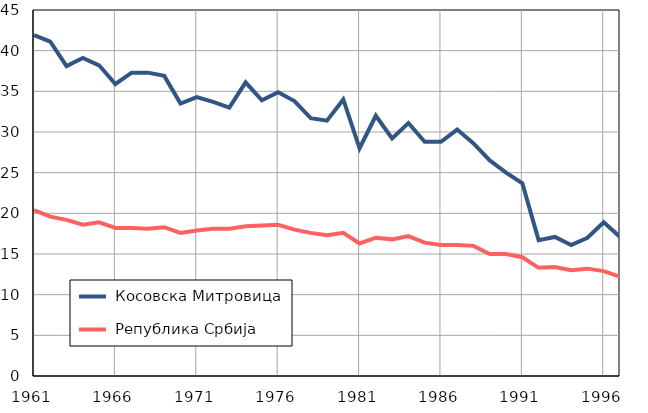
| Category |  Косовска Митровица |  Република Србија |
|---|---|---|
| 1961.0 | 41.9 | 20.4 |
| 1962.0 | 41.1 | 19.6 |
| 1963.0 | 38.1 | 19.2 |
| 1964.0 | 39.1 | 18.6 |
| 1965.0 | 38.2 | 18.9 |
| 1966.0 | 35.9 | 18.2 |
| 1967.0 | 37.3 | 18.2 |
| 1968.0 | 37.3 | 18.1 |
| 1969.0 | 36.9 | 18.3 |
| 1970.0 | 33.5 | 17.6 |
| 1971.0 | 34.3 | 17.9 |
| 1972.0 | 33.7 | 18.1 |
| 1973.0 | 33 | 18.1 |
| 1974.0 | 36.1 | 18.4 |
| 1975.0 | 33.9 | 18.5 |
| 1976.0 | 34.9 | 18.6 |
| 1977.0 | 33.8 | 18 |
| 1978.0 | 31.7 | 17.6 |
| 1979.0 | 31.4 | 17.3 |
| 1980.0 | 34 | 17.6 |
| 1981.0 | 28 | 16.3 |
| 1982.0 | 32 | 17 |
| 1983.0 | 29.2 | 16.8 |
| 1984.0 | 31.1 | 17.2 |
| 1985.0 | 28.8 | 16.4 |
| 1986.0 | 28.8 | 16.1 |
| 1987.0 | 30.3 | 16.1 |
| 1988.0 | 28.6 | 16 |
| 1989.0 | 26.5 | 15 |
| 1990.0 | 25 | 15 |
| 1991.0 | 23.7 | 14.6 |
| 1992.0 | 16.7 | 13.3 |
| 1993.0 | 17.1 | 13.4 |
| 1994.0 | 16.1 | 13 |
| 1995.0 | 17 | 13.2 |
| 1996.0 | 18.9 | 12.9 |
| 1997.0 | 17.1 | 12.2 |